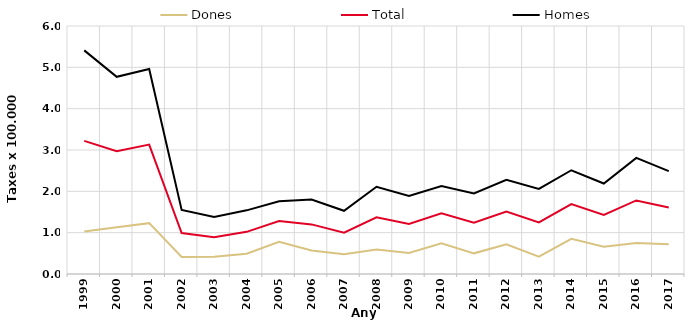
| Category | Dones | Total | Homes |
|---|---|---|---|
| 1999.0 | 1.03 | 3.22 | 5.41 |
| 2000.0 | 1.13 | 2.97 | 4.77 |
| 2001.0 | 1.23 | 3.13 | 4.96 |
| 2002.0 | 0.41 | 0.99 | 1.55 |
| 2003.0 | 0.42 | 0.89 | 1.38 |
| 2004.0 | 0.49 | 1.02 | 1.54 |
| 2005.0 | 0.78 | 1.28 | 1.76 |
| 2006.0 | 0.57 | 1.2 | 1.8 |
| 2007.0 | 0.48 | 1 | 1.53 |
| 2008.0 | 0.59 | 1.37 | 2.11 |
| 2009.0 | 0.51 | 1.21 | 1.89 |
| 2010.0 | 0.74 | 1.47 | 2.13 |
| 2011.0 | 0.5 | 1.24 | 1.95 |
| 2012.0 | 0.72 | 1.51 | 2.28 |
| 2013.0 | 0.42 | 1.25 | 2.06 |
| 2014.0 | 0.85 | 1.69 | 2.51 |
| 2015.0 | 0.66 | 1.43 | 2.19 |
| 2016.0 | 0.75 | 1.78 | 2.81 |
| 2017.0 | 0.72 | 1.61 | 2.49 |